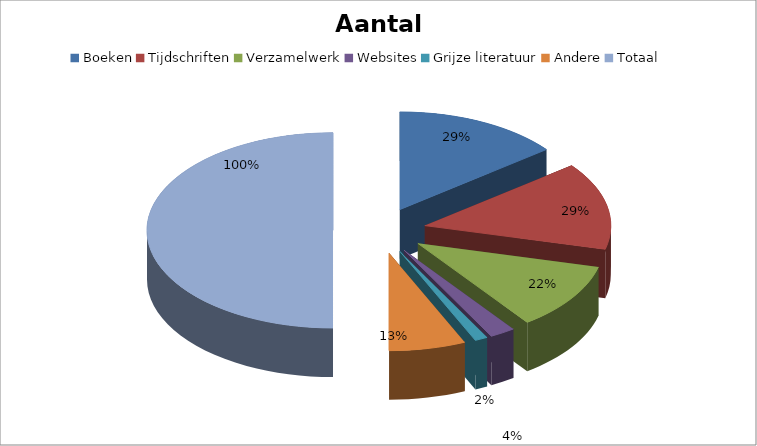
| Category | Aantal | Procent |
|---|---|---|
| Boeken | 13 | 0.289 |
| Tijdschriften | 13 | 0.289 |
| Verzamelwerk | 10 | 0.222 |
| Websites | 2 | 0.044 |
| Grijze literatuur | 1 | 0.022 |
| Andere | 6 | 0.133 |
| Totaal | 45 | 1 |